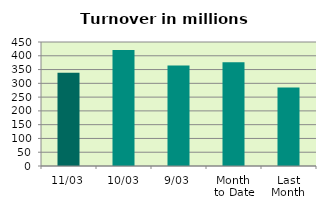
| Category | Series 0 |
|---|---|
| 11/03 | 338.06 |
| 10/03 | 420.899 |
| 9/03 | 364.728 |
| Month 
to Date | 376.172 |
| Last
Month | 285.08 |